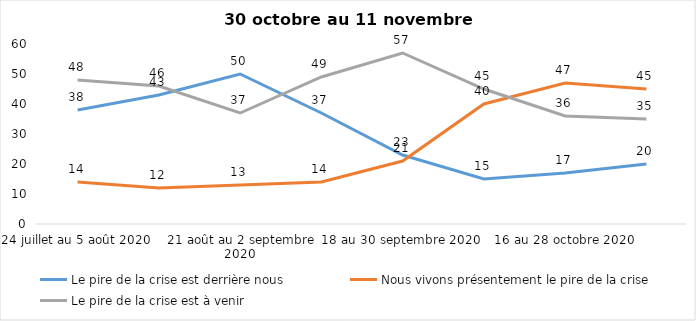
| Category | Le pire de la crise est derrière nous | Nous vivons présentement le pire de la crise | Le pire de la crise est à venir |
|---|---|---|---|
| 24 juillet au 5 août 2020 | 38 | 14 | 48 |
| 7 au 19 août 2020 | 43 | 12 | 46 |
| 21 août au 2 septembre 2020 | 50 | 13 | 37 |
| 4 au 16 septembre 2020 | 37 | 14 | 49 |
| 18 au 30 septembre 2020 | 23 | 21 | 57 |
| 2 au 14 octobre 2020 | 15 | 40 | 45 |
| 16 au 28 octobre 2020 | 17 | 47 | 36 |
| 30 octobre au 11 novembre 2020 | 20 | 45 | 35 |